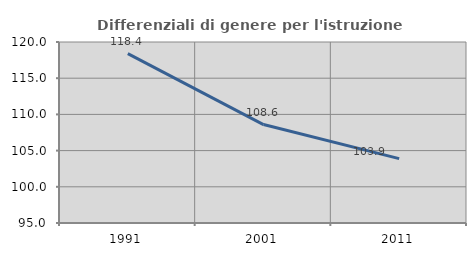
| Category | Differenziali di genere per l'istruzione superiore |
|---|---|
| 1991.0 | 118.4 |
| 2001.0 | 108.595 |
| 2011.0 | 103.886 |